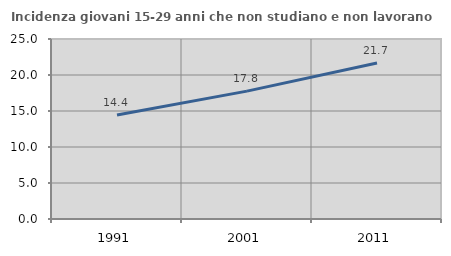
| Category | Incidenza giovani 15-29 anni che non studiano e non lavorano  |
|---|---|
| 1991.0 | 14.439 |
| 2001.0 | 17.763 |
| 2011.0 | 21.678 |